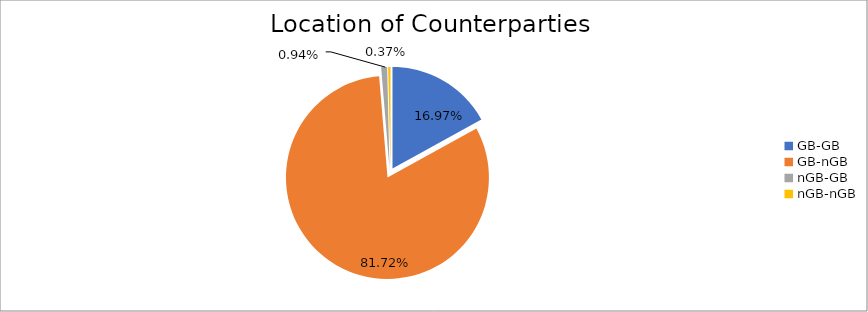
| Category | Series 0 |
|---|---|
| GB-GB | 1669031.812 |
| GB-nGB | 8036899.109 |
| nGB-GB | 92864.768 |
| nGB-nGB | 36479.451 |